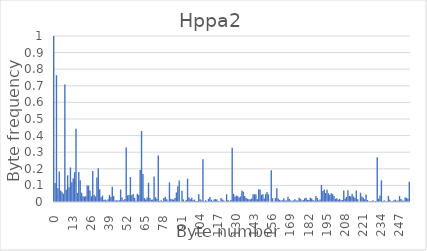
| Category | Series 0 |
|---|---|
| 0.0 | 1 |
| 1.0 | 0.115 |
| 2.0 | 0.763 |
| 3.0 | 0.082 |
| 4.0 | 0.184 |
| 5.0 | 0.069 |
| 6.0 | 0.059 |
| 7.0 | 0.05 |
| 8.0 | 0.708 |
| 9.0 | 0.074 |
| 10.0 | 0.161 |
| 11.0 | 0.089 |
| 12.0 | 0.208 |
| 13.0 | 0.119 |
| 14.0 | 0.143 |
| 15.0 | 0.18 |
| 16.0 | 0.441 |
| 17.0 | 0.055 |
| 18.0 | 0.181 |
| 19.0 | 0.131 |
| 20.0 | 0.056 |
| 21.0 | 0.034 |
| 22.0 | 0.033 |
| 23.0 | 0.035 |
| 24.0 | 0.1 |
| 25.0 | 0.099 |
| 26.0 | 0.069 |
| 27.0 | 0.035 |
| 28.0 | 0.186 |
| 29.0 | 0.043 |
| 30.0 | 0.033 |
| 31.0 | 0.148 |
| 32.0 | 0.203 |
| 33.0 | 0.077 |
| 34.0 | 0.029 |
| 35.0 | 0.039 |
| 36.0 | 0.012 |
| 37.0 | 0.015 |
| 38.0 | 0.008 |
| 39.0 | 0.017 |
| 40.0 | 0.043 |
| 41.0 | 0.03 |
| 42.0 | 0.092 |
| 43.0 | 0.036 |
| 44.0 | 0.009 |
| 45.0 | 0.011 |
| 46.0 | 0.008 |
| 47.0 | 0.011 |
| 48.0 | 0.075 |
| 49.0 | 0.027 |
| 50.0 | 0.01 |
| 51.0 | 0.018 |
| 52.0 | 0.328 |
| 53.0 | 0.04 |
| 54.0 | 0.042 |
| 55.0 | 0.15 |
| 56.0 | 0.041 |
| 57.0 | 0.048 |
| 58.0 | 0.025 |
| 59.0 | 0.008 |
| 60.0 | 0.049 |
| 61.0 | 0.042 |
| 62.0 | 0.193 |
| 63.0 | 0.428 |
| 64.0 | 0.169 |
| 65.0 | 0.024 |
| 66.0 | 0.015 |
| 67.0 | 0.027 |
| 68.0 | 0.116 |
| 69.0 | 0.023 |
| 70.0 | 0.013 |
| 71.0 | 0.014 |
| 72.0 | 0.154 |
| 73.0 | 0.029 |
| 74.0 | 0.019 |
| 75.0 | 0.279 |
| 76.0 | 0.006 |
| 77.0 | 0.011 |
| 78.0 | 0.004 |
| 79.0 | 0.024 |
| 80.0 | 0.032 |
| 81.0 | 0.016 |
| 82.0 | 0.007 |
| 83.0 | 0.119 |
| 84.0 | 0.019 |
| 85.0 | 0.016 |
| 86.0 | 0.015 |
| 87.0 | 0.024 |
| 88.0 | 0.057 |
| 89.0 | 0.094 |
| 90.0 | 0.129 |
| 91.0 | 0.001 |
| 92.0 | 0.068 |
| 93.0 | 0.016 |
| 94.0 | 0.003 |
| 95.0 | 0.013 |
| 96.0 | 0.14 |
| 97.0 | 0.028 |
| 98.0 | 0.017 |
| 99.0 | 0.025 |
| 100.0 | 0.011 |
| 101.0 | 0.015 |
| 102.0 | 0.007 |
| 103.0 | 0.007 |
| 104.0 | 0.047 |
| 105.0 | 0.016 |
| 106.0 | 0.009 |
| 107.0 | 0.258 |
| 108.0 | 0.006 |
| 109.0 | 0.01 |
| 110.0 | 0.004 |
| 111.0 | 0.019 |
| 112.0 | 0.03 |
| 113.0 | 0.013 |
| 114.0 | 0.007 |
| 115.0 | 0.016 |
| 116.0 | 0.018 |
| 117.0 | 0.015 |
| 118.0 | 0.005 |
| 119.0 | 0.004 |
| 120.0 | 0.024 |
| 121.0 | 0.015 |
| 122.0 | 0.009 |
| 123.0 | 0.001 |
| 124.0 | 0.047 |
| 125.0 | 0.011 |
| 126.0 | 0.003 |
| 127.0 | 0.012 |
| 128.0 | 0.326 |
| 129.0 | 0.049 |
| 130.0 | 0.031 |
| 131.0 | 0.039 |
| 132.0 | 0.035 |
| 133.0 | 0.028 |
| 134.0 | 0.033 |
| 135.0 | 0.068 |
| 136.0 | 0.062 |
| 137.0 | 0.037 |
| 138.0 | 0.024 |
| 139.0 | 0.019 |
| 140.0 | 0.017 |
| 141.0 | 0.016 |
| 142.0 | 0.021 |
| 143.0 | 0.047 |
| 144.0 | 0.046 |
| 145.0 | 0.046 |
| 146.0 | 0.016 |
| 147.0 | 0.077 |
| 148.0 | 0.075 |
| 149.0 | 0.043 |
| 150.0 | 0.046 |
| 151.0 | 0.02 |
| 152.0 | 0.047 |
| 153.0 | 0.061 |
| 154.0 | 0.046 |
| 155.0 | 0.002 |
| 156.0 | 0.192 |
| 157.0 | 0.022 |
| 158.0 | 0.004 |
| 159.0 | 0.024 |
| 160.0 | 0.082 |
| 161.0 | 0.021 |
| 162.0 | 0.013 |
| 163.0 | 0.01 |
| 164.0 | 0.011 |
| 165.0 | 0.022 |
| 166.0 | 0.01 |
| 167.0 | 0.01 |
| 168.0 | 0.031 |
| 169.0 | 0.018 |
| 170.0 | 0.01 |
| 171.0 | 0.008 |
| 172.0 | 0.01 |
| 173.0 | 0.016 |
| 174.0 | 0.009 |
| 175.0 | 0.01 |
| 176.0 | 0.026 |
| 177.0 | 0.019 |
| 178.0 | 0.01 |
| 179.0 | 0.012 |
| 180.0 | 0.022 |
| 181.0 | 0.026 |
| 182.0 | 0.014 |
| 183.0 | 0.012 |
| 184.0 | 0.025 |
| 185.0 | 0.021 |
| 186.0 | 0.013 |
| 187.0 | 0.008 |
| 188.0 | 0.036 |
| 189.0 | 0.024 |
| 190.0 | 0.009 |
| 191.0 | 0.016 |
| 192.0 | 0.102 |
| 193.0 | 0.066 |
| 194.0 | 0.076 |
| 195.0 | 0.054 |
| 196.0 | 0.074 |
| 197.0 | 0.053 |
| 198.0 | 0.042 |
| 199.0 | 0.053 |
| 200.0 | 0.048 |
| 201.0 | 0.036 |
| 202.0 | 0.02 |
| 203.0 | 0.022 |
| 204.0 | 0.014 |
| 205.0 | 0.018 |
| 206.0 | 0.01 |
| 207.0 | 0.012 |
| 208.0 | 0.069 |
| 209.0 | 0.021 |
| 210.0 | 0.031 |
| 211.0 | 0.071 |
| 212.0 | 0.036 |
| 213.0 | 0.033 |
| 214.0 | 0.05 |
| 215.0 | 0.034 |
| 216.0 | 0.024 |
| 217.0 | 0.069 |
| 218.0 | 0.017 |
| 219.0 | 0.001 |
| 220.0 | 0.056 |
| 221.0 | 0.033 |
| 222.0 | 0.025 |
| 223.0 | 0.016 |
| 224.0 | 0.045 |
| 225.0 | 0.012 |
| 226.0 | 0.004 |
| 227.0 | 0.003 |
| 228.0 | 0.006 |
| 229.0 | 0.01 |
| 230.0 | 0.003 |
| 231.0 | 0.006 |
| 232.0 | 0.27 |
| 233.0 | 0.021 |
| 234.0 | 0.039 |
| 235.0 | 0.131 |
| 236.0 | 0.005 |
| 237.0 | 0.011 |
| 238.0 | 0.003 |
| 239.0 | 0.006 |
| 240.0 | 0.037 |
| 241.0 | 0.013 |
| 242.0 | 0.004 |
| 243.0 | 0.005 |
| 244.0 | 0.01 |
| 245.0 | 0.014 |
| 246.0 | 0.008 |
| 247.0 | 0.009 |
| 248.0 | 0.036 |
| 249.0 | 0.018 |
| 250.0 | 0.009 |
| 251.0 | 0.008 |
| 252.0 | 0.027 |
| 253.0 | 0.025 |
| 254.0 | 0.019 |
| 255.0 | 0.122 |